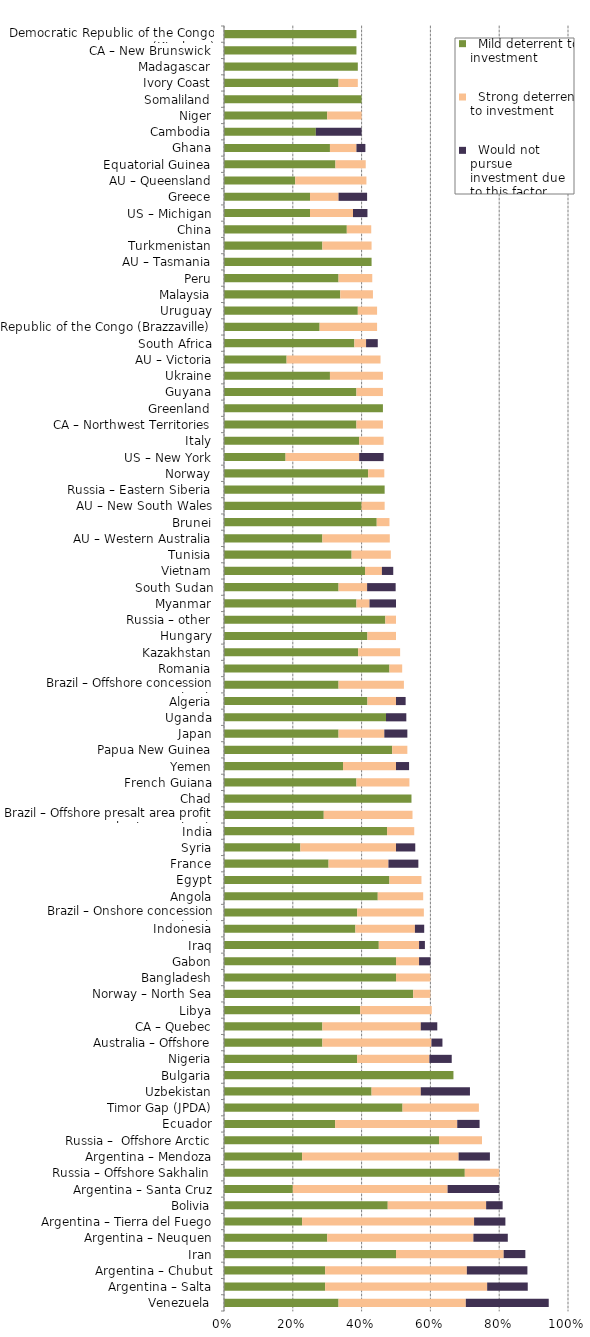
| Category |   Mild deterrent to investment |   Strong deterrent to investment |   Would not pursue investment due to this factor |
|---|---|---|---|
| Venezuela | 0.333 | 0.37 | 0.241 |
| Argentina – Salta | 0.294 | 0.471 | 0.118 |
| Argentina – Chubut | 0.294 | 0.412 | 0.176 |
| Iran | 0.5 | 0.313 | 0.063 |
| Argentina – Neuquen | 0.3 | 0.425 | 0.1 |
| Argentina – Tierra del Fuego | 0.227 | 0.5 | 0.091 |
| Bolivia | 0.476 | 0.286 | 0.048 |
| Argentina – Santa Cruz | 0.2 | 0.45 | 0.15 |
| Russia – Offshore Sakhalin | 0.7 | 0.1 | 0 |
| Argentina – Mendoza | 0.227 | 0.455 | 0.091 |
| Russia –  Offshore Arctic | 0.625 | 0.125 | 0 |
| Ecuador | 0.323 | 0.355 | 0.065 |
| Timor Gap (JPDA) | 0.519 | 0.222 | 0 |
| Uzbekistan | 0.429 | 0.143 | 0.143 |
| Bulgaria | 0.667 | 0 | 0 |
| Nigeria | 0.387 | 0.21 | 0.065 |
| Australia – Offshore | 0.286 | 0.317 | 0.032 |
| CA – Quebec | 0.286 | 0.286 | 0.048 |
| Libya | 0.396 | 0.208 | 0 |
| Norway – North Sea | 0.55 | 0.05 | 0 |
| Bangladesh | 0.5 | 0.1 | 0 |
| Gabon | 0.5 | 0.067 | 0.033 |
| Iraq | 0.45 | 0.117 | 0.017 |
| Indonesia | 0.382 | 0.173 | 0.027 |
| Brazil – Onshore concession contracts | 0.387 | 0.194 | 0 |
| Angola | 0.447 | 0.132 | 0 |
| Egypt | 0.481 | 0.093 | 0 |
| France | 0.304 | 0.174 | 0.087 |
| Syria | 0.222 | 0.278 | 0.056 |
| India | 0.474 | 0.079 | 0 |
| Brazil – Offshore presalt area profit sharing contracts | 0.29 | 0.258 | 0 |
| Chad | 0.545 | 0 | 0 |
| French Guiana | 0.385 | 0.154 | 0 |
| Yemen | 0.346 | 0.154 | 0.038 |
| Papua New Guinea | 0.489 | 0.044 | 0 |
| Japan | 0.333 | 0.133 | 0.067 |
| Uganda | 0.471 | 0 | 0.059 |
| Algeria | 0.417 | 0.083 | 0.028 |
| Brazil – Offshore concession contracts | 0.333 | 0.19 | 0 |
| Romania | 0.481 | 0.037 | 0 |
| Kazakhstan | 0.39 | 0.122 | 0 |
| Hungary | 0.417 | 0.083 | 0 |
| Russia – other | 0.469 | 0.031 | 0 |
| Myanmar | 0.385 | 0.038 | 0.077 |
| South Sudan | 0.333 | 0.083 | 0.083 |
| Vietnam | 0.41 | 0.049 | 0.033 |
| Tunisia | 0.371 | 0.114 | 0 |
| AU – Western Australia | 0.286 | 0.196 | 0 |
| Brunei | 0.444 | 0.037 | 0 |
| AU – New South Wales | 0.4 | 0.067 | 0 |
| Russia – Eastern Siberia | 0.467 | 0 | 0 |
| Norway | 0.419 | 0.047 | 0 |
| US – New York | 0.179 | 0.214 | 0.071 |
| Italy | 0.393 | 0.071 | 0 |
| CA – Northwest Territories | 0.385 | 0.077 | 0 |
| Greenland | 0.462 | 0 | 0 |
| Guyana | 0.385 | 0.077 | 0 |
| Ukraine | 0.308 | 0.154 | 0 |
| AU – Victoria | 0.182 | 0.273 | 0 |
| South Africa | 0.379 | 0.034 | 0.034 |
| Republic of the Congo (Brazzaville) | 0.278 | 0.167 | 0 |
| Uruguay | 0.389 | 0.056 | 0 |
| Malaysia | 0.338 | 0.095 | 0 |
| Peru | 0.333 | 0.098 | 0 |
| AU – Tasmania | 0.429 | 0 | 0 |
| Turkmenistan | 0.286 | 0.143 | 0 |
| China | 0.357 | 0.071 | 0 |
| US – Michigan | 0.25 | 0.125 | 0.042 |
| Greece | 0.25 | 0.083 | 0.083 |
| AU – Queensland | 0.207 | 0.207 | 0 |
| Equatorial Guinea | 0.324 | 0.088 | 0 |
| Ghana | 0.308 | 0.077 | 0.026 |
| Cambodia | 0.267 | 0 | 0.133 |
| Niger | 0.3 | 0.1 | 0 |
| Somaliland | 0.4 | 0 | 0 |
| Ivory Coast | 0.333 | 0.056 | 0 |
| Madagascar | 0.389 | 0 | 0 |
| CA – New Brunswick | 0.385 | 0 | 0 |
| Democratic Republic of the Congo (Kinshasa) | 0.385 | 0 | 0 |